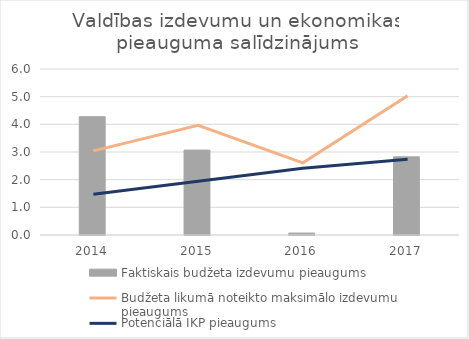
| Category | Faktiskais budžeta izdevumu pieaugums |
|---|---|
| 2014.0 | 4.276 |
| 2015.0 | 3.069 |
| 2016.0 | 0.07 |
| 2017.0 | 2.825 |